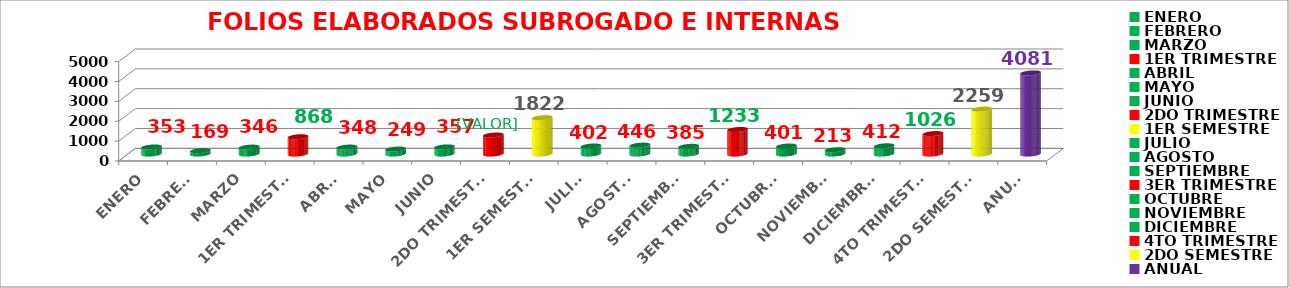
| Category | Series 0 |
|---|---|
| ENERO | 353 |
| FEBRERO | 169 |
| MARZO | 346 |
| 1ER TRIMESTRE | 868 |
| ABRIL | 348 |
| MAYO | 249 |
| JUNIO | 357 |
| 2DO TRIMESTRE | 954 |
| 1ER SEMESTRE | 1822 |
| JULIO  | 402 |
| AGOSTO | 446 |
| SEPTIEMBRE | 385 |
| 3ER TRIMESTRE | 1233 |
| OCTUBRE  | 401 |
| NOVIEMBRE  | 213 |
| DICIEMBRE  | 412 |
| 4TO TRIMESTRE | 1026 |
| 2DO SEMESTRE | 2259 |
| ANUAL | 4081 |